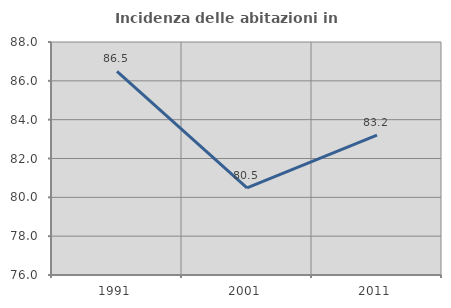
| Category | Incidenza delle abitazioni in proprietà  |
|---|---|
| 1991.0 | 86.486 |
| 2001.0 | 80.482 |
| 2011.0 | 83.202 |